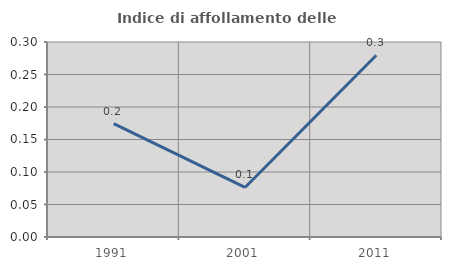
| Category | Indice di affollamento delle abitazioni  |
|---|---|
| 1991.0 | 0.175 |
| 2001.0 | 0.076 |
| 2011.0 | 0.28 |